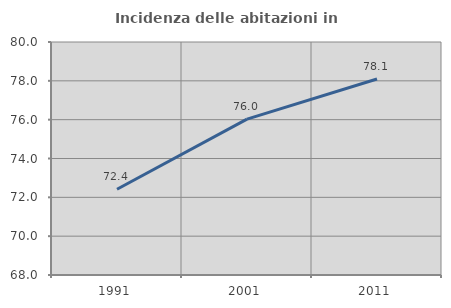
| Category | Incidenza delle abitazioni in proprietà  |
|---|---|
| 1991.0 | 72.414 |
| 2001.0 | 76.029 |
| 2011.0 | 78.093 |